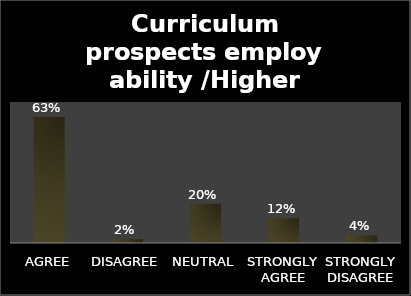
| Category | Series 0 |
|---|---|
| AGREE | 0.625 |
| DISAGREE | 0.02 |
| NEUTRAL | 0.195 |
| STRONGLY AGREE | 0.122 |
| STRONGLY DISAGREE | 0.038 |